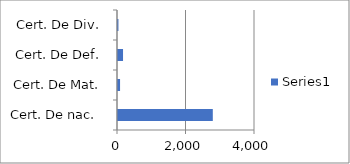
| Category | Series 0 |
|---|---|
| Cert. De nac.  | 2768 |
| Cert. De Mat. | 60 |
| Cert. De Def. | 147 |
| Cert. De Div. | 13 |